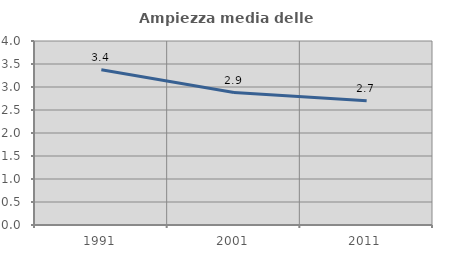
| Category | Ampiezza media delle famiglie |
|---|---|
| 1991.0 | 3.377 |
| 2001.0 | 2.88 |
| 2011.0 | 2.702 |